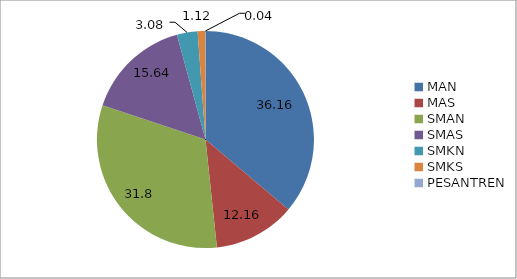
| Category | Series 0 |
|---|---|
| MAN | 36.16 |
| MAS | 12.16 |
| SMAN | 31.8 |
| SMAS | 15.64 |
| SMKN | 3.08 |
| SMKS | 1.12 |
| PESANTREN | 0.04 |